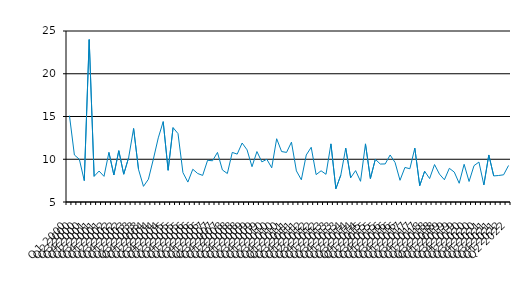
| Category | Series 0 |
|---|---|
| Q1 2000 | 15.1 |
| Q2 2000 | 10.5 |
| Q3 2000 | 10 |
| Q4 2000 | 7.5 |
| Q1 2001 | 24 |
| Q2 2001 | 8 |
| Q3 2001 | 8.62 |
| Q4 2001 | 8 |
| Q1 2002 | 10.8 |
| Q2 2002 | 8.16 |
| Q3 2002 | 11 |
| Q4 2002 | 8.25 |
| Q1 2003 | 10.2 |
| Q2 2003 | 13.6 |
| Q3 2003 | 8.8 |
| Q4 2003 | 6.83 |
| Q1 2004 | 7.66 |
| Q2 2004 | 10 |
| Q3 2004 | 12.5 |
| Q4 2004 | 14.4 |
| Q1 2005 | 8.71 |
| Q2 2005 | 13.7 |
| Q3 2005 | 13 |
| Q4 2005 | 8.44 |
| Q1 2006 | 7.33 |
| Q2 2006 | 8.83 |
| Q3 2006 | 8.33 |
| Q4 2006 | 8.11 |
| Q1 2007 | 9.88 |
| Q2 2007 | 9.82 |
| Q3 2007 | 10.8 |
| Q4 2007 | 8.75 |
| Q1 2008 | 8.33 |
| Q2 2008 | 10.8 |
| Q3 2008 | 10.6 |
| Q4 2008 | 11.9 |
| Q1 2009 | 11.1 |
| Q2 2009 | 9.13 |
| Q3 2009 | 10.9 |
| Q4 2009 | 9.69 |
| Q1 2010 | 10 |
| Q2 2010 | 9 |
| Q3 2010 | 12.4 |
| Q4 2010 | 10.9 |
| Q1 2011 | 10.8 |
| Q2 2011 | 12 |
| Q3 2011 | 8.64 |
| Q4 2011 | 7.6 |
| Q1 2012 | 10.5 |
| Q2 2012 | 11.4 |
| Q3 2012 | 8.2 |
| Q4 2012 | 8.65 |
| Q1 2013 | 8.24 |
| Q2 2013 | 11.8 |
| Q3 2013 | 6.55 |
| Q4 2013 | 8.14 |
| Q1 2014 | 11.3 |
| Q2 2014 | 7.83 |
| Q3 2014 | 8.67 |
| Q4 2014 | 7.42 |
| Q1 2015 | 11.8 |
| Q2 2015 | 7.74 |
| Q3 2015 | 10 |
| Q4 2015 | 9.44 |
| Q1 2016 | 9.45 |
| Q2 2016 | 10.5 |
| Q3 2016 | 9.62 |
| Q4 2016 | 7.54 |
| Q1 2017 | 9.04 |
| Q2 2017 | 8.89 |
| Q3 2017 | 11.3 |
| Q4 2017 | 6.91 |
| Q1 2018 | 8.6 |
| Q2 2018 | 7.74 |
| Q3 2018 | 9.38 |
| Q4 2018 | 8.26 |
| Q1 2019 | 7.6 |
| Q2 2019 | 8.941 |
| Q3 2019 | 8.5 |
| Q4 2019 | 7.19 |
| Q1 2020 | 9.41 |
| Q2 2020 | 7.4 |
| Q3 2020 | 9.25 |
| Q4 2020 | 9.67 |
| Q1 2021 | 7 |
| Q2 2021 | 10.5 |
| Q3 2021 | 8.05 |
| Q4 2021 | 8.1 |
| Q1 2022 | 8.18 |
| Q2 2022 | 9.27 |